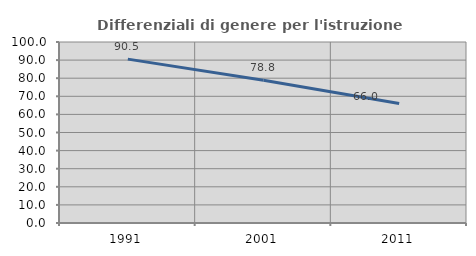
| Category | Differenziali di genere per l'istruzione superiore |
|---|---|
| 1991.0 | 90.541 |
| 2001.0 | 78.843 |
| 2011.0 | 66.038 |